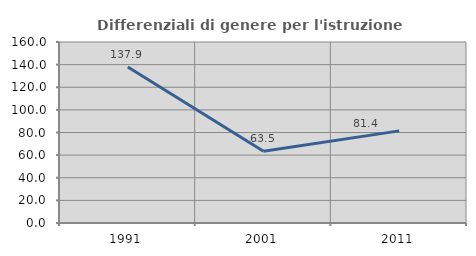
| Category | Differenziali di genere per l'istruzione superiore |
|---|---|
| 1991.0 | 137.945 |
| 2001.0 | 63.492 |
| 2011.0 | 81.428 |